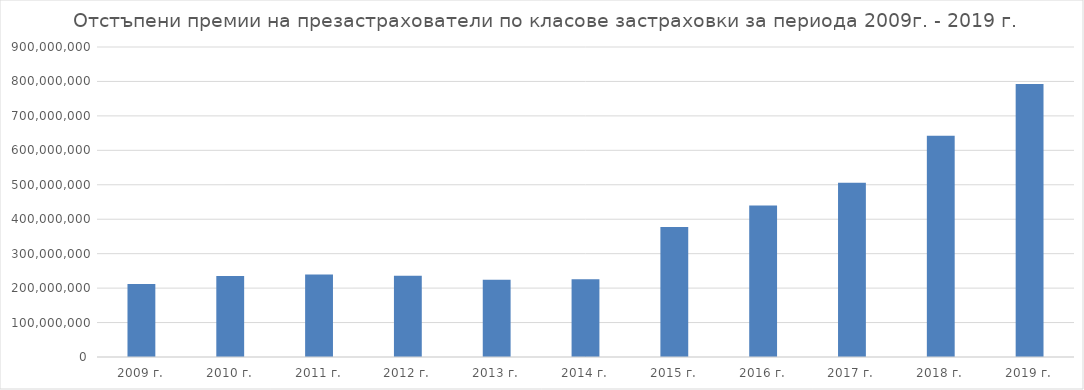
| Category | Series 0 |
|---|---|
| 2009 г. | 211607008.844 |
| 2010 г. | 235369864.249 |
| 2011 г. | 239630505.177 |
| 2012 г. | 235585203.769 |
| 2013 г. | 224010693.226 |
| 2014 г. | 225803248.762 |
| 2015 г. | 377411422.386 |
| 2016 г. | 439683141.844 |
| 2017 г. | 506089881.084 |
| 2018 г. | 642550670.561 |
| 2019 г. | 792260487.86 |